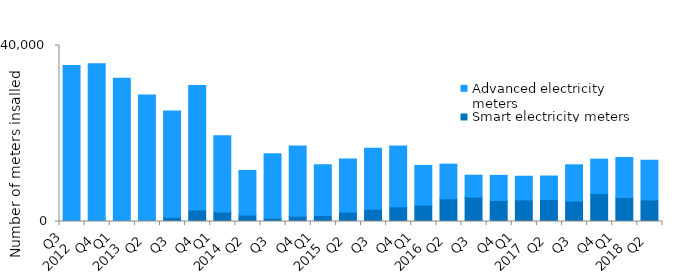
| Category | Smart electricity meters | Advanced electricity meters |
|---|---|---|
| 0 | 0 | 35455 |
| 1 | 0 | 35834 |
| 2 | 0 | 32529 |
| 3 | 0 | 28722 |
| 4 | 946 | 24189 |
| 5 | 2590 | 28300 |
| 6 | 2175 | 17332 |
| 7 | 1445 | 10152 |
| 8 | 714 | 14700 |
| 9 | 1214 | 15955 |
| 10 | 1369 | 11534 |
| 11 | 2137 | 12073 |
| 12 | 2767 | 13888 |
| 13 | 3347 | 13832 |
| 14 | 3725 | 9015 |
| 15 | 5170 | 7865 |
| 16 | 5545 | 4972 |
| 17 | 4764 | 5716 |
| 18 | 4906 | 5385 |
| 19 | 5029 | 5307 |
| 20 | 4636 | 8248 |
| 21 | 6344 | 7825 |
| 22 | 5439 | 9114 |
| 23 | 4897 | 9033 |